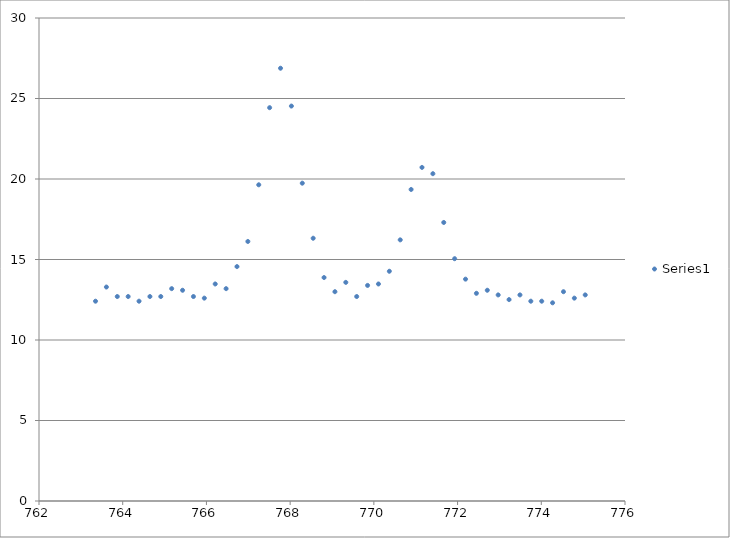
| Category | Series 0 |
|---|---|
| 763.35 | 12.41 |
| 763.61 | 13.29 |
| 763.87 | 12.7 |
| 764.13 | 12.7 |
| 764.39 | 12.41 |
| 764.65 | 12.7 |
| 764.91 | 12.7 |
| 765.17 | 13.19 |
| 765.43 | 13.09 |
| 765.69 | 12.7 |
| 765.95 | 12.6 |
| 766.21 | 13.48 |
| 766.47 | 13.19 |
| 766.73 | 14.56 |
| 766.99 | 16.12 |
| 767.25 | 19.64 |
| 767.51 | 24.43 |
| 767.77 | 26.88 |
| 768.03 | 24.53 |
| 768.29 | 19.74 |
| 768.55 | 16.32 |
| 768.81 | 13.88 |
| 769.07 | 13 |
| 769.33 | 13.58 |
| 769.59 | 12.7 |
| 769.85 | 13.39 |
| 770.11 | 13.48 |
| 770.37 | 14.27 |
| 770.63 | 16.22 |
| 770.89 | 19.35 |
| 771.15 | 20.72 |
| 771.41 | 20.33 |
| 771.67 | 17.3 |
| 771.93 | 15.05 |
| 772.19 | 13.78 |
| 772.45 | 12.9 |
| 772.71 | 13.09 |
| 772.97 | 12.8 |
| 773.23 | 12.51 |
| 773.49 | 12.8 |
| 773.75 | 12.41 |
| 774.01 | 12.41 |
| 774.27 | 12.31 |
| 774.53 | 13 |
| 774.79 | 12.6 |
| 775.05 | 12.8 |